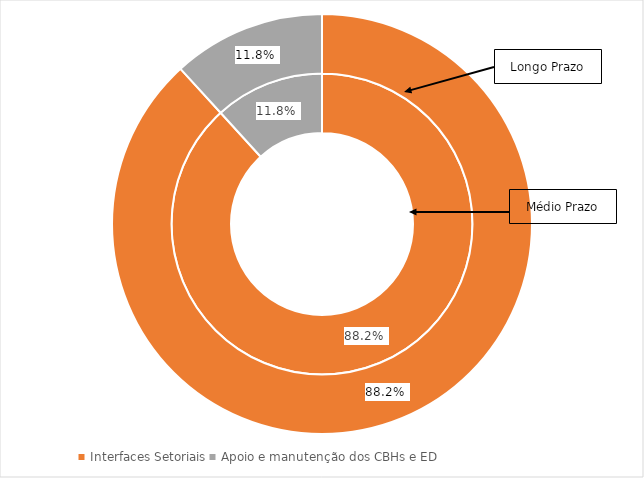
| Category | Curto Prazo (%) | Médio Prazo (%) | Longo Prazo (%) |
|---|---|---|---|
| Recursos Hídricos | 0 | 0 | 0 |
| Interfaces Setoriais | 0 | 0.882 | 0.882 |
| Apoio e manutenção dos CBHs e ED | 0 | 0.118 | 0.118 |